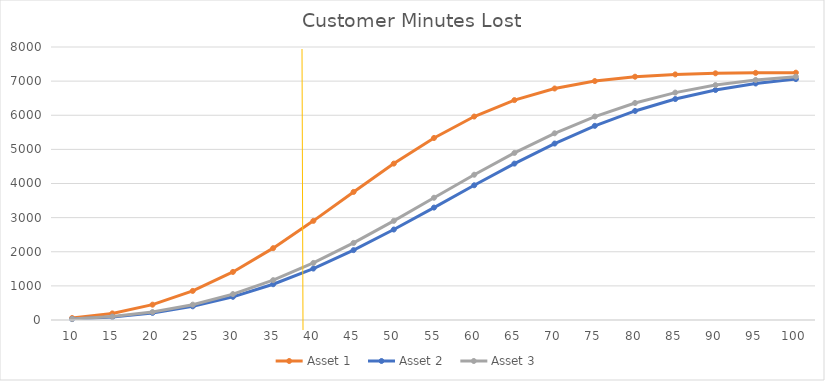
| Category | Asset 1 | Asset 2 | Asset 3 |
|---|---|---|---|
| 10.0 | 57.769 | 26.352 | 29.635 |
| 15.0 | 193.131 | 88.554 | 99.534 |
| 20.0 | 449.464 | 208.151 | 233.718 |
| 25.0 | 851.897 | 400.979 | 449.464 |
| 30.0 | 1408.419 | 678.871 | 759.046 |
| 35.0 | 2105.123 | 1047.952 | 1167.684 |
| 40.0 | 2905.106 | 1507.145 | 1671.848 |
| 45.0 | 3752.664 | 2047.26 | 2258.415 |
| 50.0 | 4582.874 | 2651.016 | 2905.106 |
| 55.0 | 5334.456 | 3294.23 | 3582.429 |
| 60.0 | 5962.115 | 3948.178 | 4257.032 |
| 65.0 | 6444.264 | 4582.874 | 4895.949 |
| 70.0 | 6783.734 | 5170.712 | 5470.961 |
| 75.0 | 7001.919 | 5689.797 | 5962.115 |
| 80.0 | 7129.367 | 6126.284 | 6359.659 |
| 85.0 | 7196.71 | 6475.262 | 6664.011 |
| 90.0 | 7228.742 | 6740.093 | 6883.949 |
| 95.0 | 7242.388 | 6930.495 | 7033.639 |
| 100.0 | 7247.568 | 7059.923 | 7129.367 |